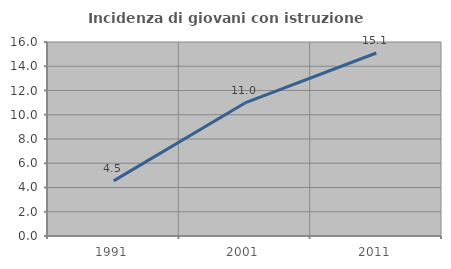
| Category | Incidenza di giovani con istruzione universitaria |
|---|---|
| 1991.0 | 4.545 |
| 2001.0 | 10.976 |
| 2011.0 | 15.094 |